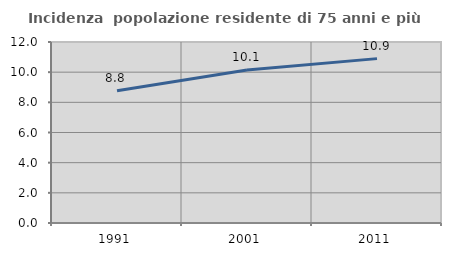
| Category | Incidenza  popolazione residente di 75 anni e più |
|---|---|
| 1991.0 | 8.768 |
| 2001.0 | 10.143 |
| 2011.0 | 10.898 |